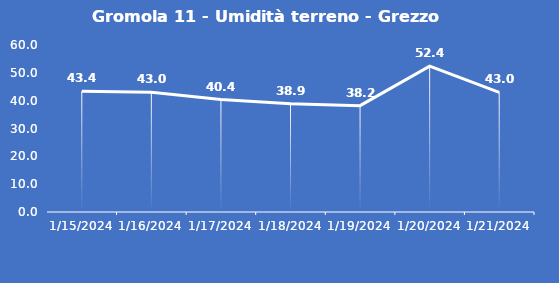
| Category | Gromola 11 - Umidità terreno - Grezzo (%VWC) |
|---|---|
| 1/15/24 | 43.4 |
| 1/16/24 | 43 |
| 1/17/24 | 40.4 |
| 1/18/24 | 38.9 |
| 1/19/24 | 38.2 |
| 1/20/24 | 52.4 |
| 1/21/24 | 43 |